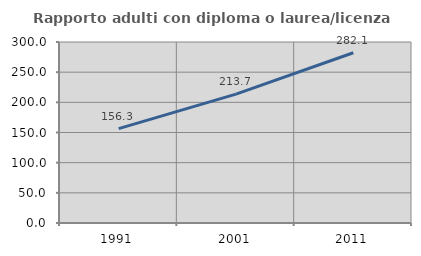
| Category | Rapporto adulti con diploma o laurea/licenza media  |
|---|---|
| 1991.0 | 156.338 |
| 2001.0 | 213.699 |
| 2011.0 | 282.143 |